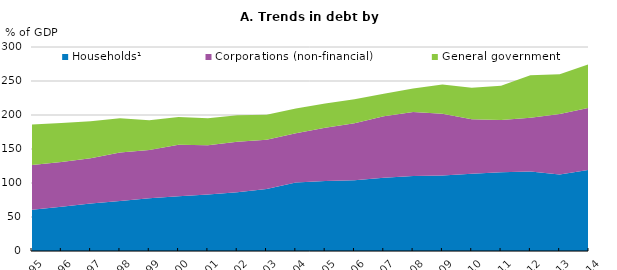
| Category | Households¹ | Corporations (non-financial) | General government |
|---|---|---|---|
| 1995.0 | 60.725 | 65.824 | 59.516 |
| 1996.0 | 65.003 | 65.902 | 57.194 |
| 1997.0 | 69.749 | 66.82 | 54.191 |
| 1998.0 | 73.708 | 71.281 | 50.237 |
| 1999.0 | 77.716 | 70.678 | 43.847 |
| 2000.0 | 80.376 | 75.978 | 40.862 |
| 2001.0 | 83.028 | 72.492 | 39.864 |
| 2002.0 | 86.529 | 74.196 | 39.086 |
| 2003.0 | 91.26 | 72.176 | 36.837 |
| 2004.0 | 100.559 | 72.718 | 36.182 |
| 2005.0 | 102.765 | 78.648 | 35.546 |
| 2006.0 | 103.867 | 84.183 | 35.29 |
| 2007.0 | 107.884 | 90.195 | 33.288 |
| 2008.0 | 110.427 | 94.08 | 34.346 |
| 2009.0 | 111.207 | 90.494 | 42.971 |
| 2010.0 | 113.662 | 80.011 | 46.265 |
| 2011.0 | 115.699 | 76.96 | 50.414 |
| 2012.0 | 116.926 | 78.991 | 62.568 |
| 2013.0 | 112.618 | 88.877 | 58.43 |
| 2014.0 | 119.409 | 91.206 | 64.048 |